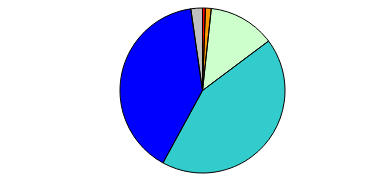
| Category | Series 0 |
|---|---|
| 0 | 1 |
| 1 | 2 |
| 2 | 23 |
| 3 | 76 |
| 4 | 70 |
| 5 | 4 |